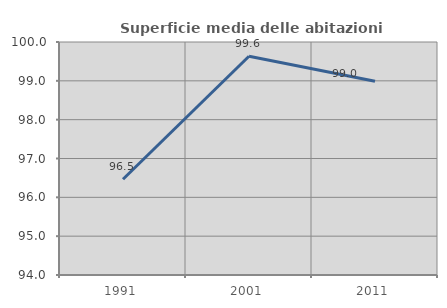
| Category | Superficie media delle abitazioni occupate |
|---|---|
| 1991.0 | 96.466 |
| 2001.0 | 99.632 |
| 2011.0 | 98.989 |